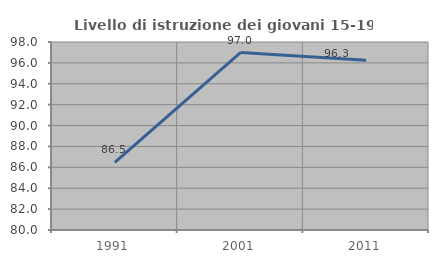
| Category | Livello di istruzione dei giovani 15-19 anni |
|---|---|
| 1991.0 | 86.472 |
| 2001.0 | 96.992 |
| 2011.0 | 96.262 |